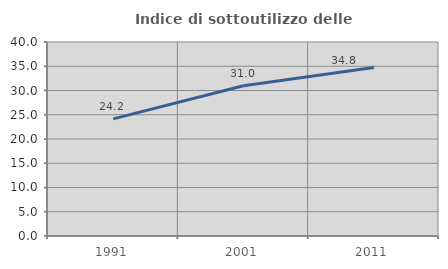
| Category | Indice di sottoutilizzo delle abitazioni  |
|---|---|
| 1991.0 | 24.152 |
| 2001.0 | 30.965 |
| 2011.0 | 34.761 |